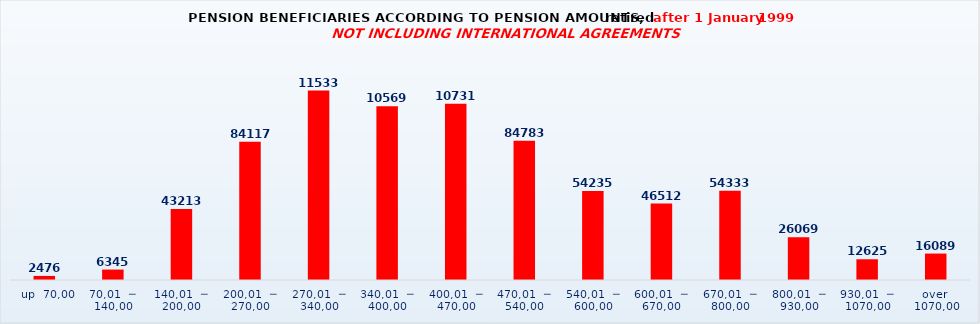
| Category | Series 0 |
|---|---|
|   up  70,00 | 2476 |
| 70,01  ─  140,00 | 6345 |
| 140,01  ─  200,00 | 43213 |
| 200,01  ─  270,00 | 84117 |
| 270,01  ─  340,00 | 115338 |
| 340,01  ─  400,00 | 105694 |
| 400,01  ─  470,00 | 107319 |
| 470,01  ─  540,00 | 84783 |
| 540,01  ─  600,00 | 54235 |
| 600,01  ─  670,00 | 46512 |
| 670,01  ─  800,00 | 54333 |
| 800,01  ─  930,00 | 26069 |
| 930,01  ─  1070,00 | 12625 |
| over  1070,00 | 16089 |